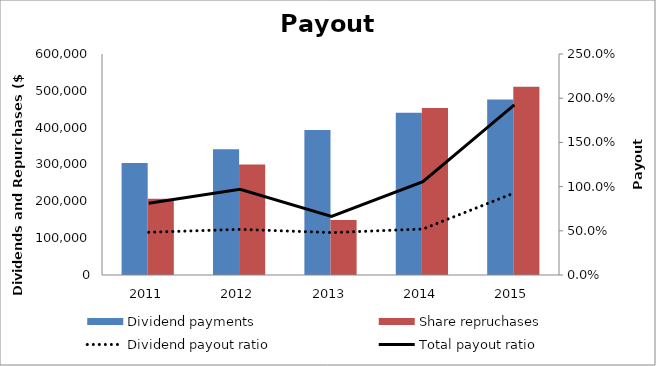
| Category | Dividend payments | Share repruchases |
|---|---|---|
| 2011.0 | 304083 | 206861 |
| 2012.0 | 341206 | 299706 |
| 2013.0 | 393801 | 149062 |
| 2014.0 | 440414 | 453506 |
| 2015.0 | 476132 | 511123 |